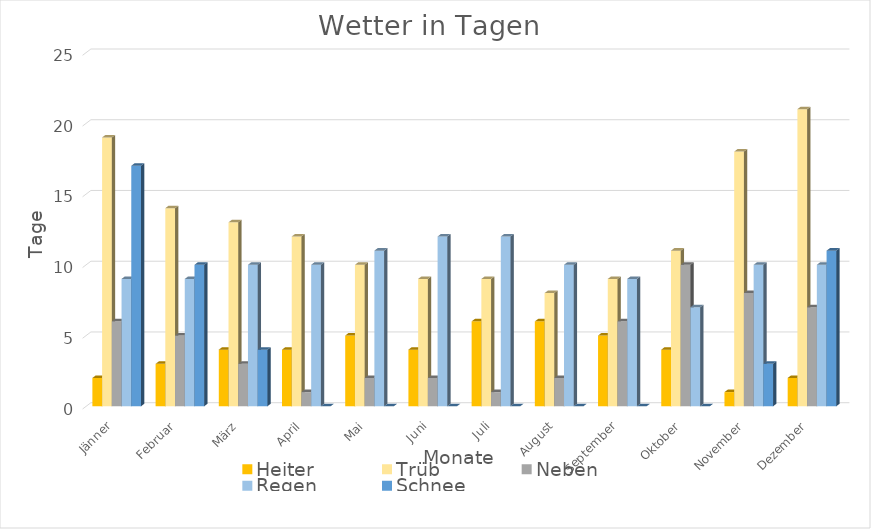
| Category | Heiter  | Trüb | Neben | Regen | Schnee |
|---|---|---|---|---|---|
| Jänner | 2 | 19 | 6 | 9 | 17 |
| Februar | 3 | 14 | 5 | 9 | 10 |
| März | 4 | 13 | 3 | 10 | 4 |
| April | 4 | 12 | 1 | 10 | 0 |
| Mai | 5 | 10 | 2 | 11 | 0 |
| Juni | 4 | 9 | 2 | 12 | 0 |
| Juli | 6 | 9 | 1 | 12 | 0 |
| August | 6 | 8 | 2 | 10 | 0 |
| September | 5 | 9 | 6 | 9 | 0 |
| Oktober | 4 | 11 | 10 | 7 | 0 |
| November | 1 | 18 | 8 | 10 | 3 |
| Dezember | 2 | 21 | 7 | 10 | 11 |